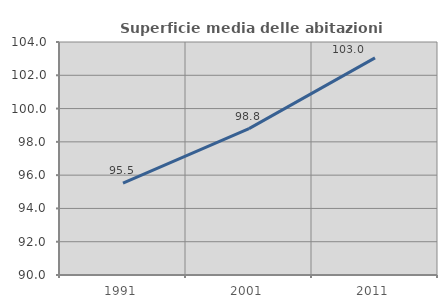
| Category | Superficie media delle abitazioni occupate |
|---|---|
| 1991.0 | 95.523 |
| 2001.0 | 98.794 |
| 2011.0 | 103.049 |